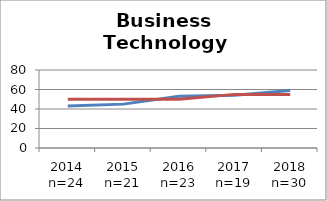
| Category | Retention Rate | Goal |
|---|---|---|
| 2014 n=24 | 43 | 50 |
| 2015 n=21 | 45 | 50 |
| 2016 n=23 | 53 | 50 |
| 2017 n=19 | 54 | 55 |
| 2018 n=30 | 59 | 55 |